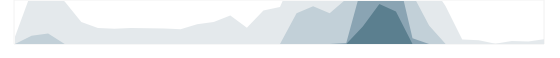
| Category | Логистика | Series 1 | Series 2 | Series 3 |
|---|---|---|---|---|
| 0.333333333333333 | 124 | 0 | 0 | 0 |
| nan | 890 | 140 | 0 | 0 |
| nan | 930 | 180 | 0 | 0 |
| nan | 723 | 0 | 0 | 0 |
| 0.416666666666667 | 376 | 0 | 0 | 0 |
| nan | 271 | 0 | 0 | 0 |
| nan | 259 | 0 | 0 | 0 |
| nan | 272 | 0 | 0 | 0 |
| 0.5 | 268 | 0 | 0 | 0 |
| nan | 263 | 0 | 0 | 0 |
| nan | 253 | 0 | 0 | 0 |
| nan | 337 | 0 | 0 | 0 |
| 0.583333333333333 | 376 | 0 | 0 | 0 |
| nan | 487 | 0 | 0 | 0 |
| nan | 276 | 0 | 0 | 0 |
| nan | 572 | 0 | 0 | 0 |
| 0.666666666666667 | 632 | 0 | 0 | 0 |
| nan | 1273 | 523 | 0 | 0 |
| nan | 1393 | 643 | 0 | 0 |
| nan | 1276 | 526 | 0 | 0 |
| 0.75 | 1518 | 768 | 18 | 0 |
| nan | 2549 | 1799 | 1049 | 299 |
| nan | 2933 | 2183 | 1433 | 683 |
| nan | 2802 | 2052 | 1302 | 552 |
| 0.833333333333333 | 1600 | 850 | 100 | 0 |
| nan | 1065 | 315 | 0 | 0 |
| nan | 643 | 0 | 0 | 0 |
| nan | 75 | 0 | 0 | 0 |
| 0.916666666666667 | 62 | 0 | 0 | 0 |
| nan | 5 | 0 | 0 | 0 |
| nan | 52 | 0 | 0 | 0 |
| nan | 41 | 0 | 0 | 0 |
| 0.9993055555555556 | 85 | 0 | 0 | 0 |